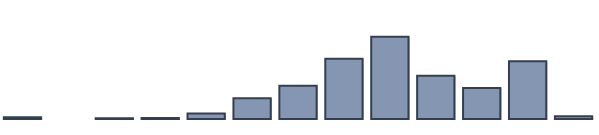
| Category | Series 0 |
|---|---|
| 0 | 0.5 |
| 1 | 0 |
| 2 | 0.2 |
| 3 | 0.3 |
| 4 | 1.6 |
| 5 | 6.1 |
| 6 | 9.8 |
| 7 | 17.7 |
| 8 | 24.2 |
| 9 | 12.7 |
| 10 | 9.1 |
| 11 | 17 |
| 12 | 0.8 |